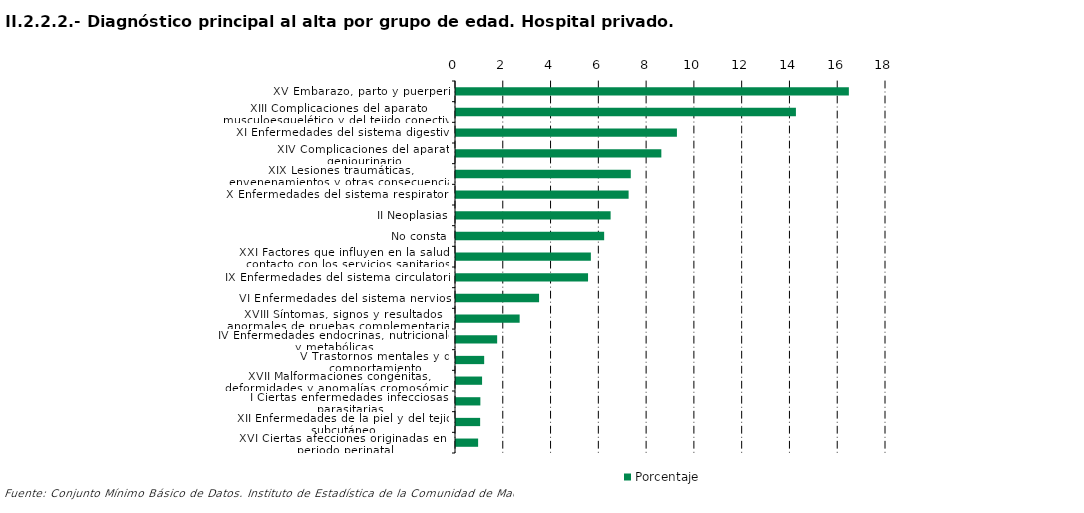
| Category | Porcentaje |
|---|---|
| XV Embarazo, parto y puerperio | 16.445 |
| XIII Complicaciones del aparato musculoesquelético y del tejido conectivo | 14.229 |
| XI Enfermedades del sistema digestivo | 9.248 |
| XIV Complicaciones del aparato geniourinario | 8.596 |
| XIX Lesiones traumáticas, envenenamientos y otras consecuencias de causas externas | 7.316 |
| X Enfermedades del sistema respiratorio | 7.225 |
| II Neoplasias | 6.472 |
| No consta | 6.202 |
| XXI Factores que influyen en la salud y contacto con los servicios sanitarios | 5.646 |
| IX Enfermedades del sistema circulatorio | 5.528 |
| VI Enfermedades del sistema nervioso | 3.477 |
| XVIII Síntomas, signos y resultados anormales de pruebas complementarias, no clasificados bajo otro concepto | 2.664 |
| IV Enfermedades endocrinas, nutricionales y metabólicas | 1.723 |
| V Trastornos mentales y de comportamiento | 1.179 |
| XVII Malformaciones congénitas, deformidades y anomalías cromosómicas | 1.092 |
| I Ciertas enfermedades infecciosas y parasitarias | 1.02 |
| XII Enfermedades de la piel y del tejido subcutáneo | 1.011 |
| XVI Ciertas afecciones originadas en el periodo perinatal | 0.926 |